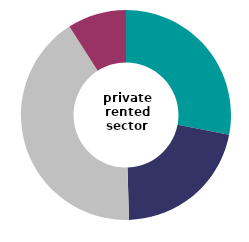
| Category | private 
rented |
|---|---|
| 0 | 28.005 |
| 1 | 21.543 |
| 2 | 41.39 |
| 3 | 9.062 |